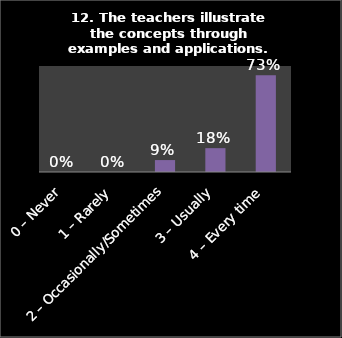
| Category | Series 0 |
|---|---|
| 0 – Never | 0 |
| 1 – Rarely | 0 |
| 2 – Occasionally/Sometimes | 0.09 |
| 3 – Usually | 0.18 |
| 4 – Every time | 0.73 |